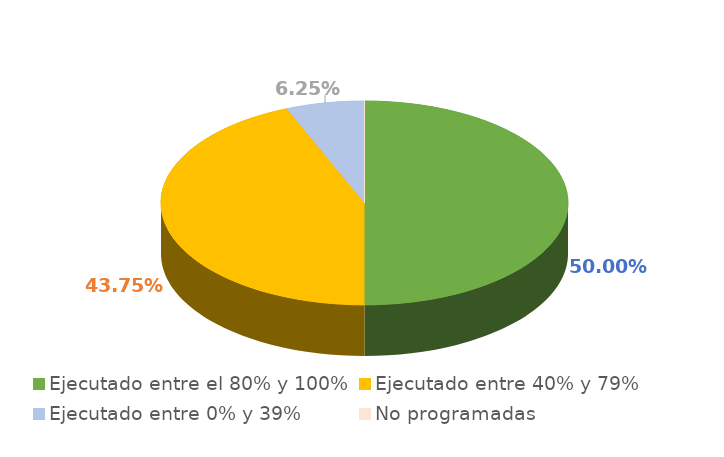
| Category | Series 0 |
|---|---|
| Ejecutado entre el 80% y 100% | 0.5 |
| Ejecutado entre 40% y 79% | 0.438 |
| Ejecutado entre 0% y 39% | 0.062 |
| No programadas | 0 |